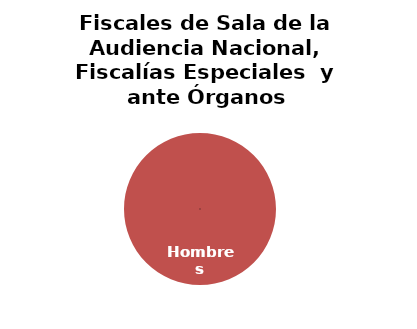
| Category | Fiscales de Sala de la Audiencia Nacional, Fiscalías Especiales  y ante Órganos Constitucionales |
|---|---|
| Hombres | 5 |
| Mujeres | 0 |